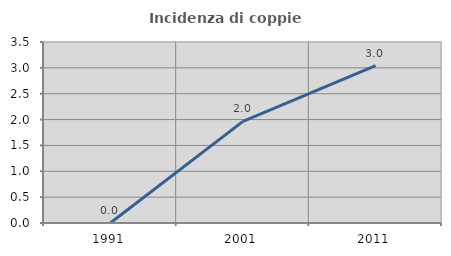
| Category | Incidenza di coppie miste |
|---|---|
| 1991.0 | 0 |
| 2001.0 | 1.965 |
| 2011.0 | 3.043 |